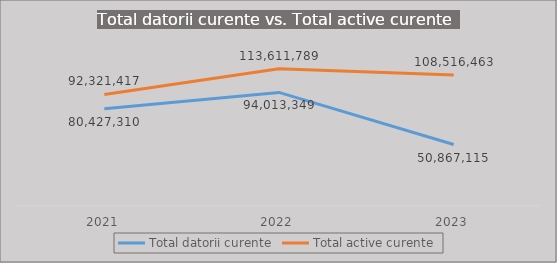
| Category | Total datorii curente | Total active curente |
|---|---|---|
| 2021.0 | 80427310 | 92321417 |
| 2022.0 | 94013349 | 113611789 |
| 2023.0 | 50867115 | 108516463 |